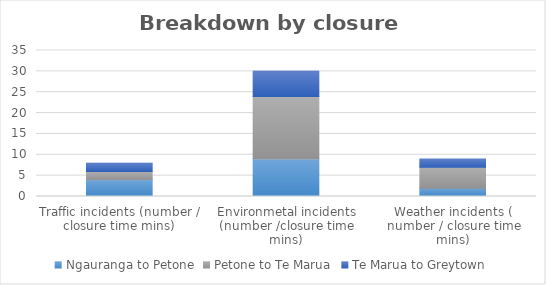
| Category | Ngauranga to Petone | Petone to Te Marua | Te Marua to Greytown |
|---|---|---|---|
| Traffic incidents (number / closure time mins) | 4 | 2 | 2 |
| Environmetal incidents (number /closure time mins) | 9 | 15 | 6 |
| Weather incidents ( number / closure time mins) | 2 | 5 | 2 |